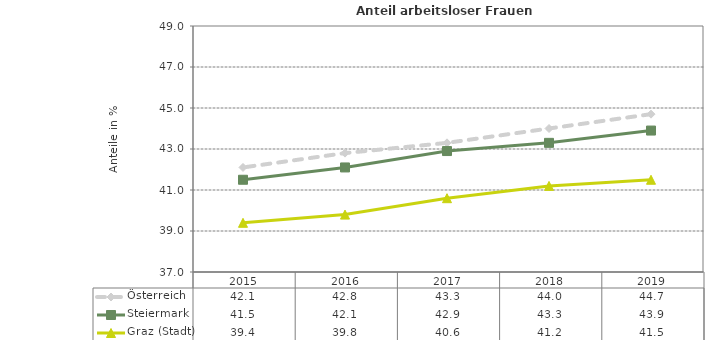
| Category | Österreich | Steiermark | Graz (Stadt) |
|---|---|---|---|
| 2019.0 | 44.7 | 43.9 | 41.5 |
| 2018.0 | 44 | 43.3 | 41.2 |
| 2017.0 | 43.3 | 42.9 | 40.6 |
| 2016.0 | 42.8 | 42.1 | 39.8 |
| 2015.0 | 42.1 | 41.5 | 39.4 |